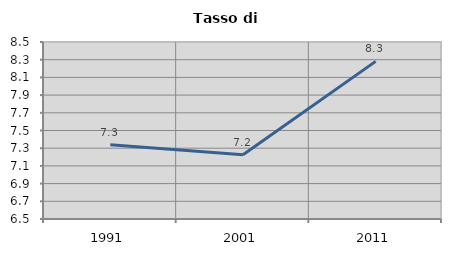
| Category | Tasso di disoccupazione   |
|---|---|
| 1991.0 | 7.339 |
| 2001.0 | 7.226 |
| 2011.0 | 8.281 |